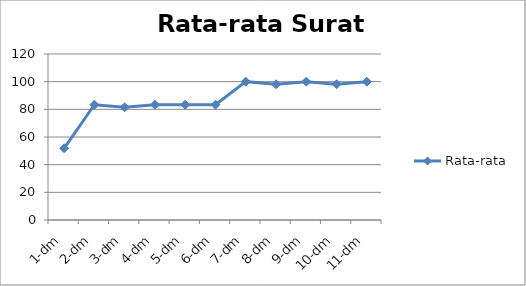
| Category | Rata-rata |
|---|---|
| 1-dm | 51.852 |
| 2-dm | 83.333 |
| 3-dm | 81.481 |
| 4-dm | 83.333 |
| 5-dm | 83.333 |
| 6-dm | 83.333 |
| 7-dm | 100 |
| 8-dm | 98.148 |
| 9-dm | 100 |
| 10-dm | 98.148 |
| 11-dm | 100 |